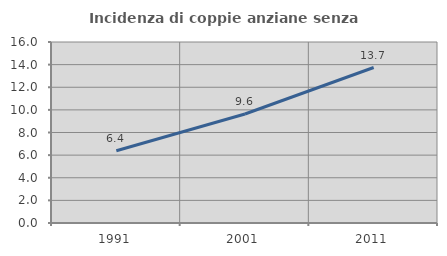
| Category | Incidenza di coppie anziane senza figli  |
|---|---|
| 1991.0 | 6.386 |
| 2001.0 | 9.634 |
| 2011.0 | 13.743 |